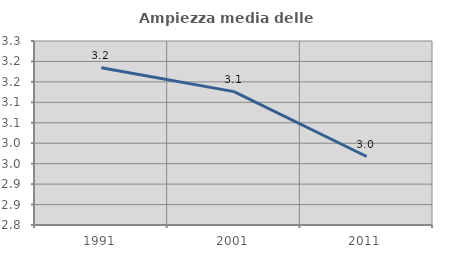
| Category | Ampiezza media delle famiglie |
|---|---|
| 1991.0 | 3.185 |
| 2001.0 | 3.126 |
| 2011.0 | 2.968 |